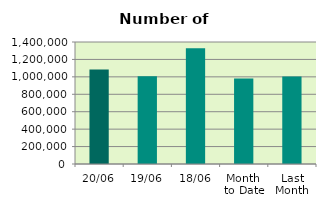
| Category | Series 0 |
|---|---|
| 20/06 | 1083618 |
| 19/06 | 1007142 |
| 18/06 | 1327196 |
| Month 
to Date | 982527 |
| Last
Month | 1004730.273 |